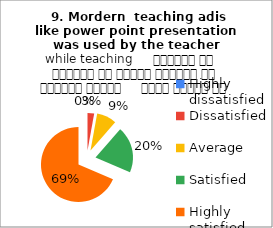
| Category |  9. Mordern  teaching adis like power point presentation was used by the teacher while teaching     शिक्षक ने शिक्षण के दौरान शिक्षण की आधुनिक तकनीक     पावर पॉइंट का प्रयोग किया |
|---|---|
| Highly dissatisfied | 0 |
| Dissatisfied | 1 |
| Average | 3 |
| Satisfied | 7 |
| Highly satisfied | 24 |